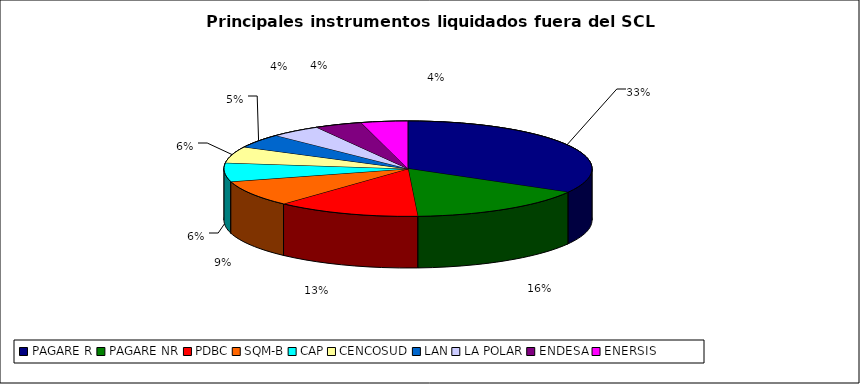
| Category | Series 0 |
|---|---|
| PAGARE R | 2851 |
| PAGARE NR | 1365 |
| PDBC | 1086 |
| SQM-B | 757 |
| CAP | 544 |
| CENCOSUD | 476 |
| LAN | 407 |
| LA POLAR | 381 |
| ENDESA | 357 |
| ENERSIS | 352 |